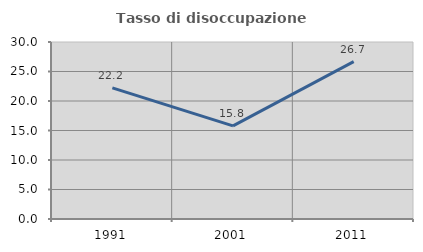
| Category | Tasso di disoccupazione giovanile  |
|---|---|
| 1991.0 | 22.222 |
| 2001.0 | 15.789 |
| 2011.0 | 26.667 |